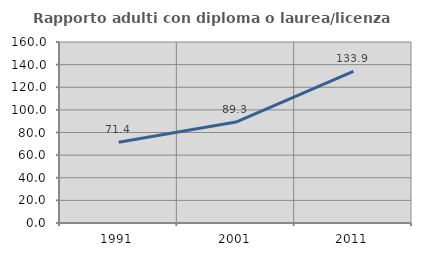
| Category | Rapporto adulti con diploma o laurea/licenza media  |
|---|---|
| 1991.0 | 71.384 |
| 2001.0 | 89.27 |
| 2011.0 | 133.932 |